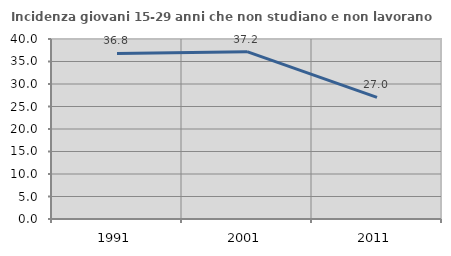
| Category | Incidenza giovani 15-29 anni che non studiano e non lavorano  |
|---|---|
| 1991.0 | 36.788 |
| 2001.0 | 37.194 |
| 2011.0 | 27.01 |